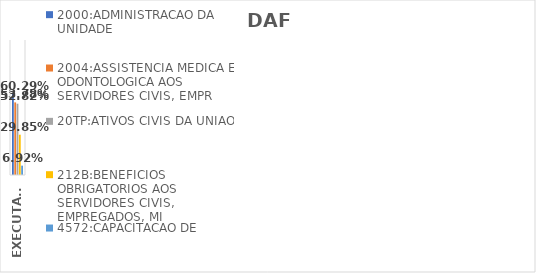
| Category | 2000:ADMINISTRACAO DA UNIDADE | 2004:ASSISTENCIA MEDICA E ODONTOLOGICA AOS SERVIDORES CIVIS, EMPR | 20TP:ATIVOS CIVIS DA UNIAO | 212B:BENEFICIOS OBRIGATORIOS AOS SERVIDORES CIVIS, EMPREGADOS, MI | 4572:CAPACITACAO DE SERVIDORES PUBLICOS FEDERAIS EM PROCESSO DE Q |
|---|---|---|---|---|---|
| EXECUTADO | 0.603 | 0.538 | 0.528 | 0.299 | 0.069 |